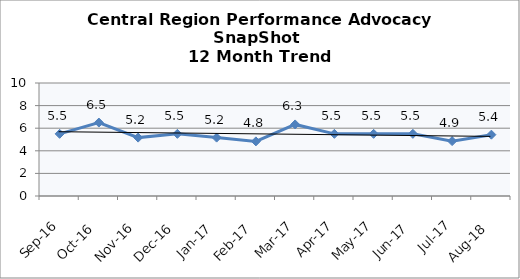
| Category | Central Region |
|---|---|
| Sep-16 | 5.5 |
| Oct-16 | 6.5 |
| Nov-16 | 5.167 |
| Dec-16 | 5.5 |
| Jan-17 | 5.167 |
| Feb-17 | 4.833 |
| Mar-17 | 6.333 |
| Apr-17 | 5.5 |
| May-17 | 5.5 |
| Jun-17 | 5.5 |
| Jul-17 | 4.857 |
| Aug-18 | 5.429 |